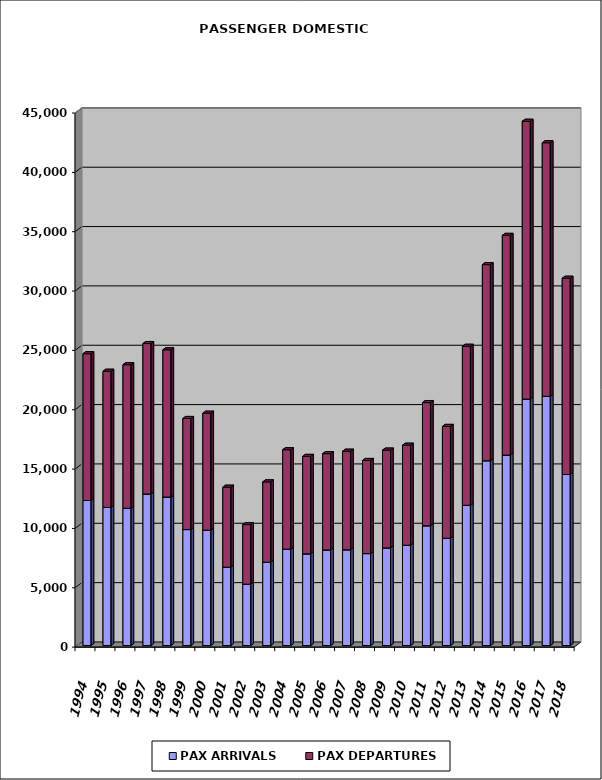
| Category | PAX ARRIVALS | PAX DEPARTURES |
|---|---|---|
| 1994.0 | 12224 | 12368 |
| 1995.0 | 11644 | 11468 |
| 1996.0 | 11571 | 12093 |
| 1997.0 | 12774 | 12674 |
| 1998.0 | 12514 | 12407 |
| 1999.0 | 9775 | 9359 |
| 2000.0 | 9723 | 9854 |
| 2001.0 | 6607 | 6736 |
| 2002.0 | 5177 | 5015 |
| 2003.0 | 7029 | 6762 |
| 2004.0 | 8124 | 8378 |
| 2005.0 | 7728 | 8210 |
| 2006.0 | 8057 | 8111 |
| 2007.0 | 8072 | 8305 |
| 2008.0 | 7752 | 7843 |
| 2009.0 | 8231 | 8239 |
| 2010.0 | 8458 | 8422 |
| 2011.0 | 10095 | 10378 |
| 2012.0 | 9046 | 9419 |
| 2013.0 | 11819 | 13397 |
| 2014.0 | 15575 | 16522 |
| 2015.0 | 16048 | 18512 |
| 2016.0 | 20768 | 23406 |
| 2017.0 | 21004 | 21361 |
| 2018.0 | 14417 | 16532 |